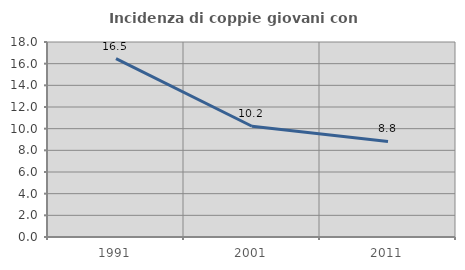
| Category | Incidenza di coppie giovani con figli |
|---|---|
| 1991.0 | 16.465 |
| 2001.0 | 10.222 |
| 2011.0 | 8.817 |